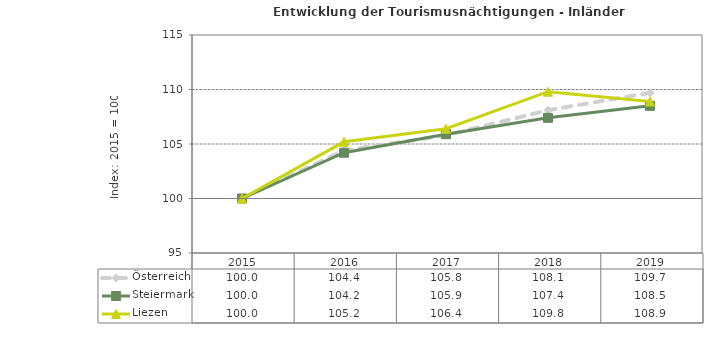
| Category | Österreich | Steiermark | Liezen |
|---|---|---|---|
| 2019.0 | 109.7 | 108.5 | 108.9 |
| 2018.0 | 108.1 | 107.4 | 109.8 |
| 2017.0 | 105.8 | 105.9 | 106.4 |
| 2016.0 | 104.4 | 104.2 | 105.2 |
| 2015.0 | 100 | 100 | 100 |